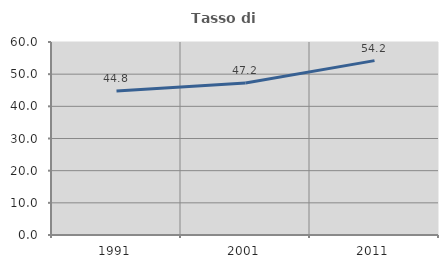
| Category | Tasso di occupazione   |
|---|---|
| 1991.0 | 44.782 |
| 2001.0 | 47.249 |
| 2011.0 | 54.215 |